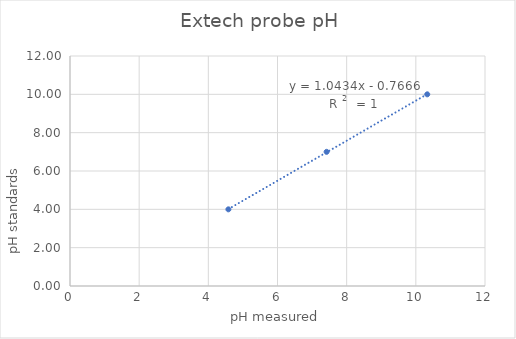
| Category | Series 0 |
|---|---|
| 4.58 | 4 |
| 7.42 | 7 |
| 10.33 | 10 |